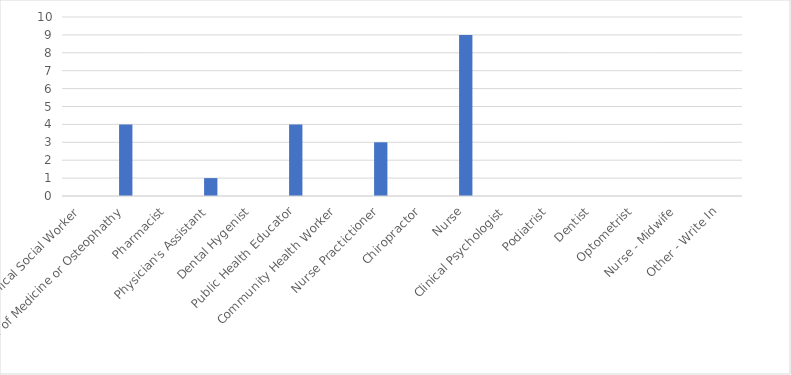
| Category | Number of Responses |
|---|---|
| Clinical Social Worker | 0 |
| Doctor of Medicine or Osteophathy | 4 |
| Pharmacist | 0 |
| Physician's Assistant | 1 |
| Dental Hygenist | 0 |
| Public Health Educator | 4 |
| Community Health Worker | 0 |
| Nurse Practictioner | 3 |
| Chiropractor | 0 |
| Nurse | 9 |
| Clinical Psychologist | 0 |
| Podiatrist | 0 |
| Dentist | 0 |
| Optometrist | 0 |
| Nurse - Midwife | 0 |
| Other - Write In | 0 |